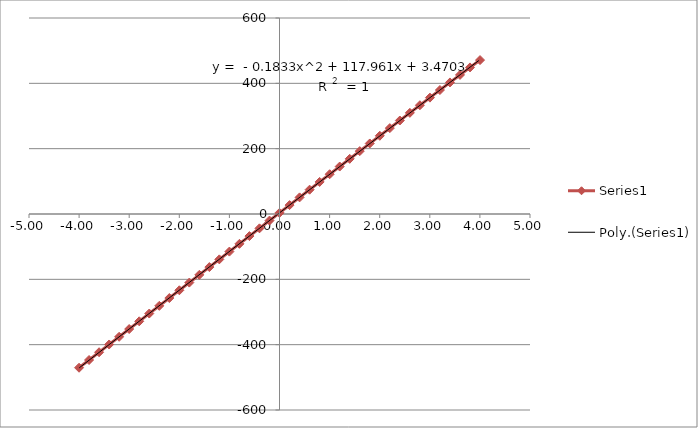
| Category | Series 1 |
|---|---|
| 4.00277 | 471.23 |
| 3.80266 | 448.68 |
| 3.6030499999999996 | 425.78 |
| 3.40274 | 402.72 |
| 3.2023 | 379.52 |
| 3.0026900000000003 | 356.25 |
| 2.8024 | 332.94 |
| 2.60211 | 309.6 |
| 2.40231 | 286.21 |
| 2.20231 | 262.91 |
| 2.0017899999999997 | 239.41 |
| 1.80183 | 215.9 |
| 1.60185 | 192.43 |
| 1.4014799999999998 | 168.87 |
| 1.20169 | 145.31 |
| 1.00163 | 121.76 |
| 0.80119 | 98.17 |
| 0.60093 | 74.5 |
| 0.40127999999999997 | 50.87 |
| 0.20084999999999997 | 27.24 |
| 0.00039 | 3.5 |
| -0.19933 | -20.12 |
| -0.39969 | -43.87 |
| -0.60008 | -67.62 |
| -0.7997799999999999 | -91.35 |
| -0.99999 | -115.09 |
| -1.2006000000000001 | -138.89 |
| -1.40007 | -162.5 |
| -1.59995 | -186.27 |
| -1.7999999999999998 | -209.96 |
| -1.9989100000000002 | -233.54 |
| -2.19883 | -257.26 |
| -2.39897 | -281.07 |
| -2.5996799999999998 | -304.72 |
| -2.79962 | -328.46 |
| -3.0002899999999997 | -352.17 |
| -3.20071 | -375.88 |
| -3.40061 | -399.48 |
| -3.60115 | -423.19 |
| -3.80115 | -446.94 |
| -4.00114 | -470.59 |